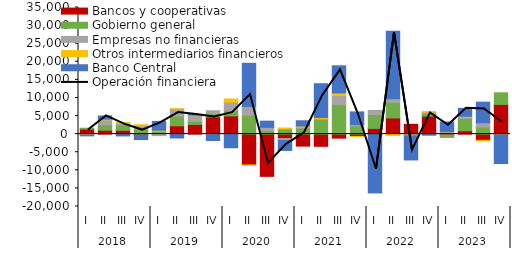
| Category | Bancos y cooperativas | Gobierno general | Empresas no financieras | Otros intermediarios financieros | Banco Central |
|---|---|---|---|---|---|
| 0 | 1397.801 | 235.632 | -83.56 | -138.035 | -252.82 |
| 1 | 1077.762 | 1504.673 | 1356.124 | 214.215 | 872.22 |
| 2 | 1052.846 | 1509.857 | 448.531 | 245.563 | -495.87 |
| 3 | -306.499 | 1625.849 | 723.919 | 266.304 | -1185.782 |
| 4 | -21.106 | 828.073 | -393.541 | 266.297 | 2429.827 |
| 5 | 2308.815 | 2686.164 | 1961.172 | 72.613 | -1071.366 |
| 6 | 2677.373 | 853.875 | 1582.22 | 145.283 | 142.172 |
| 7 | 4750.727 | 906.93 | 808.038 | -131.251 | -1619.017 |
| 8 | 5043.509 | 1503.307 | 2309.269 | 854.352 | -3766.184 |
| 9 | -8509.202 | 5214.739 | 2437.834 | -146.454 | 11929.007 |
| 10 | -11666.258 | 962.307 | 874.227 | 21.263 | 1729.234 |
| 11 | -1230.751 | 1438.424 | -514.103 | 253.284 | -2759.208 |
| 12 | -3304.261 | 1670.027 | 310.556 | 259.554 | 1455.217 |
| 13 | -3361.37 | 4160.788 | 99.194 | 319.873 | 9354.292 |
| 14 | -1109.271 | 8132.565 | 2576.344 | 672.019 | 7500.376 |
| 15 | -639.157 | 2294.808 | 343.142 | -20.557 | 3508.969 |
| 16 | 1593.478 | 3814.885 | 1142.406 | -89.65 | -16162.137 |
| 17 | 4476.231 | 4344.741 | 980.514 | -389.208 | 18652.618 |
| 18 | 2721.829 | -170.483 | -155.128 | -128.632 | -6677.199 |
| 19 | 4984.509 | 765.443 | 349.067 | 78.813 | -298.343 |
| 20 | -319.595 | -581.124 | 692.608 | 22.546 | 2650.399 |
| 21 | 932.354 | 3444.084 | 365.678 | 184.702 | 2195.225 |
| 22 | -1705.548 | 1964.931 | 1174.582 | -187.334 | 5699.787 |
| 23 | 8213.952 | 3216.735 | -25.193 | -172.824 | -7930.37 |